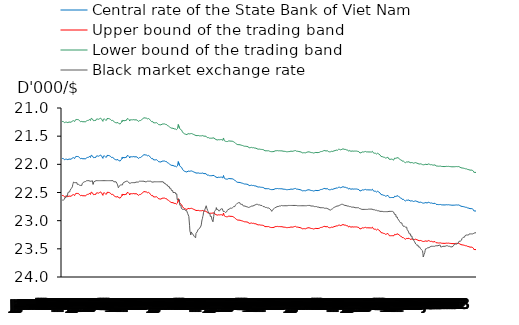
| Category | Central rate of the State Bank of Viet Nam | Upper bound of the trading band | Lower bound of the trading band | Black market exchange rate |
|---|---|---|---|---|
| 0 | 21.896 | 22.553 | 21.239 | 22.635 |
| 1900-01-01 | 21.896 | 22.553 | 21.239 | 22.635 |
| 1900-01-02 | 21.896 | 22.553 | 21.239 | 22.635 |
| 1900-01-03 | 21.896 | 22.553 | 21.239 | 22.635 |
| 1900-01-04 | 21.907 | 22.564 | 21.25 | 22.62 |
| 1900-01-05 | 21.907 | 22.564 | 21.25 | 22.62 |
| 1900-01-06 | 21.919 | 22.577 | 21.261 | 22.62 |
| 1900-01-07 | 21.909 | 22.566 | 21.252 | 22.59 |
| 1900-01-08 | 21.909 | 22.566 | 21.252 | 22.59 |
| 1900-01-09 | 21.909 | 22.566 | 21.252 | 22.59 |
| 1900-01-10 | 21.911 | 22.568 | 21.254 | 22.59 |
| 1900-01-11 | 21.913 | 22.57 | 21.256 | 22.56 |
| 1900-01-12 | 21.909 | 22.566 | 21.252 | 22.56 |
| 1900-01-13 | 21.907 | 22.564 | 21.25 | 22.56 |
| 1900-01-14 | 21.917 | 22.575 | 21.259 | 22.56 |
| 1900-01-15 | 21.917 | 22.575 | 21.259 | 22.51 |
| 1900-01-16 | 21.917 | 22.575 | 21.259 | 22.51 |
| 1900-01-17 | 21.913 | 22.57 | 21.256 | 22.49 |
| 1900-01-18 | 21.906 | 22.563 | 21.249 | 22.49 |
| 1900-01-19 | 21.901 | 22.558 | 21.244 | 22.49 |
| 1900-01-20 | 21.91 | 22.567 | 21.253 | 22.49 |
| 1900-01-21 | 21.908 | 22.565 | 21.251 | 22.46 |
| 1900-01-22 | 21.908 | 22.565 | 21.251 | 22.46 |
| 1900-01-23 | 21.908 | 22.565 | 21.251 | 22.46 |
| 1900-01-24 | 21.91 | 22.567 | 21.253 | 22.43 |
| 1900-01-25 | 21.898 | 22.555 | 21.241 | 22.43 |
| 1900-01-26 | 21.893 | 22.55 | 21.236 | 22.415 |
| 1900-01-27 | 21.886 | 22.543 | 21.229 | 22.4 |
| 1900-01-28 | 21.881 | 22.537 | 21.225 | 22.36 |
| 1900-01-29 | 21.881 | 22.537 | 21.225 | 22.34 |
| 1900-01-30 | 21.881 | 22.537 | 21.225 | 22.315 |
| 1900-01-31 | 21.892 | 22.549 | 21.235 | 22.305 |
| 1900-02-01 | 21.894 | 22.551 | 21.237 | 22.325 |
| 1900-02-02 | 21.897 | 22.554 | 21.24 | 22.325 |
| 1900-02-03 | 21.876 | 22.532 | 21.22 | 22.325 |
| 1900-02-04 | 21.861 | 22.517 | 21.205 | 22.325 |
| 1900-02-05 | 21.861 | 22.517 | 21.205 | 22.325 |
| 1900-02-06 | 21.861 | 22.517 | 21.205 | 22.325 |
| 1900-02-07 | 21.861 | 22.517 | 21.205 | 22.325 |
| 1900-02-08 | 21.861 | 22.517 | 21.205 | 22.325 |
| 1900-02-09 | 21.861 | 22.517 | 21.205 | 22.355 |
| 1900-02-10 | 21.861 | 22.517 | 21.205 | 22.355 |
| 1900-02-11 | 21.861 | 22.517 | 21.205 | 22.355 |
| 1900-02-12 | 21.861 | 22.517 | 21.205 | 22.355 |
| 1900-02-13 | 21.861 | 22.517 | 21.205 | 22.355 |
| 1900-02-14 | 21.873 | 22.529 | 21.217 | 22.37 |
| 1900-02-15 | 21.884 | 22.541 | 21.227 | 22.37 |
| 1900-02-16 | 21.895 | 22.552 | 21.238 | 22.37 |
| 1900-02-17 | 21.901 | 22.558 | 21.244 | 22.375 |
| 1900-02-18 | 21.9 | 22.557 | 21.243 | 22.375 |
| 1900-02-19 | 21.9 | 22.557 | 21.243 | 22.375 |
| 1900-02-20 | 21.9 | 22.557 | 21.243 | 22.375 |
| 1900-02-21 | 21.894 | 22.551 | 21.237 | 22.375 |
| 1900-02-22 | 21.899 | 22.556 | 21.242 | 22.345 |
| 1900-02-23 | 21.901 | 22.558 | 21.244 | 22.345 |
| 1900-02-24 | 21.903 | 22.56 | 21.246 | 22.335 |
| 1900-02-25 | 21.899 | 22.556 | 21.242 | 22.32 |
| 1900-02-26 | 21.899 | 22.556 | 21.242 | 22.31 |
| 1900-02-27 | 21.899 | 22.556 | 21.242 | 22.31 |
| 1900-02-28 | 21.914 | 22.571 | 21.257 | 22.31 |
| 1900-02-28 | 21.907 | 22.564 | 21.25 | 22.305 |
| 1900-03-01 | 21.905 | 22.562 | 21.248 | 22.305 |
| 1900-03-02 | 21.904 | 22.561 | 21.247 | 22.305 |
| 1900-03-03 | 21.889 | 22.546 | 21.232 | 22.305 |
| 1900-03-04 | 21.889 | 22.546 | 21.232 | 22.305 |
| 1900-03-05 | 21.889 | 22.546 | 21.232 | 22.29 |
| 1900-03-06 | 21.873 | 22.529 | 21.217 | 22.29 |
| 1900-03-07 | 21.878 | 22.534 | 21.222 | 22.29 |
| 1900-03-08 | 21.877 | 22.533 | 21.221 | 22.29 |
| 1900-03-09 | 21.884 | 22.541 | 21.227 | 22.29 |
| 1900-03-10 | 21.874 | 22.53 | 21.218 | 22.29 |
| 1900-03-11 | 21.874 | 22.53 | 21.218 | 22.29 |
| 1900-03-12 | 21.874 | 22.53 | 21.218 | 22.29 |
| 1900-03-13 | 21.859 | 22.515 | 21.203 | 22.29 |
| 1900-03-14 | 21.872 | 22.528 | 21.216 | 22.3 |
| 1900-03-15 | 21.878 | 22.534 | 21.222 | 22.3 |
| 1900-03-16 | 21.863 | 22.519 | 21.207 | 22.3 |
| 1900-03-17 | 21.838 | 22.493 | 21.183 | 22.3 |
| 1900-03-18 | 21.838 | 22.493 | 21.183 | 22.3 |
| 1900-03-19 | 21.838 | 22.493 | 21.183 | 22.3 |
| 1900-03-20 | 21.848 | 22.503 | 21.193 | 22.29 |
| 1900-03-21 | 21.853 | 22.509 | 21.197 | 22.29 |
| 1900-03-22 | 21.861 | 22.517 | 21.205 | 22.355 |
| 1900-03-23 | 21.882 | 22.538 | 21.226 | 22.33 |
| 1900-03-24 | 21.879 | 22.535 | 21.223 | 22.31 |
| 1900-03-25 | 21.879 | 22.535 | 21.223 | 22.3 |
| 1900-03-26 | 21.879 | 22.535 | 21.223 | 22.3 |
| 1900-03-27 | 21.891 | 22.548 | 21.234 | 22.3 |
| 1900-03-28 | 21.889 | 22.546 | 21.232 | 22.3 |
| 1900-03-29 | 21.878 | 22.534 | 21.222 | 22.29 |
| 1900-03-30 | 21.857 | 22.513 | 21.201 | 22.29 |
| 1900-03-31 | 21.85 | 22.506 | 21.194 | 22.29 |
| 1900-04-01 | 21.85 | 22.506 | 21.194 | 22.29 |
| 1900-04-02 | 21.85 | 22.506 | 21.194 | 22.29 |
| 1900-04-03 | 21.852 | 22.508 | 21.196 | 22.29 |
| 1900-04-04 | 21.853 | 22.509 | 21.197 | 22.29 |
| 1900-04-05 | 21.857 | 22.513 | 21.201 | 22.29 |
| 1900-04-06 | 21.852 | 22.508 | 21.196 | 22.29 |
| 1900-04-07 | 21.846 | 22.501 | 21.191 | 22.29 |
| 1900-04-08 | 21.846 | 22.501 | 21.191 | 22.29 |
| 1900-04-09 | 21.846 | 22.501 | 21.191 | 22.29 |
| 1900-04-10 | 21.842 | 22.497 | 21.187 | 22.29 |
| 1900-04-11 | 21.834 | 22.489 | 21.179 | 22.29 |
| 1900-04-12 | 21.838 | 22.493 | 21.183 | 22.29 |
| 1900-04-13 | 21.838 | 22.493 | 21.183 | 22.29 |
| 1900-04-14 | 21.862 | 22.518 | 21.206 | 22.29 |
| 1900-04-15 | 21.862 | 22.518 | 21.206 | 22.29 |
| 1900-04-16 | 21.862 | 22.518 | 21.206 | 22.29 |
| 1900-04-17 | 21.894 | 22.551 | 21.237 | 22.29 |
| 1900-04-18 | 21.855 | 22.511 | 21.199 | 22.29 |
| 1900-04-19 | 21.838 | 22.493 | 21.183 | 22.29 |
| 1900-04-20 | 21.848 | 22.503 | 21.193 | 22.29 |
| 1900-04-21 | 21.851 | 22.507 | 21.195 | 22.29 |
| 1900-04-22 | 21.851 | 22.507 | 21.195 | 22.29 |
| 1900-04-23 | 21.851 | 22.507 | 21.195 | 22.29 |
| 1900-04-24 | 21.87 | 22.526 | 21.214 | 22.29 |
| 1900-04-25 | 21.875 | 22.531 | 21.219 | 22.29 |
| 1900-04-26 | 21.873 | 22.529 | 21.217 | 22.29 |
| 1900-04-27 | 21.872 | 22.528 | 21.216 | 22.29 |
| 1900-04-28 | 21.842 | 22.497 | 21.187 | 22.29 |
| 1900-04-29 | 21.842 | 22.497 | 21.187 | 22.29 |
| 1900-04-30 | 21.842 | 22.497 | 21.187 | 22.29 |
| 1900-05-01 | 21.842 | 22.497 | 21.187 | 22.29 |
| 1900-05-02 | 21.842 | 22.497 | 21.187 | 22.29 |
| 1900-05-03 | 21.828 | 22.483 | 21.173 | 22.29 |
| 1900-05-04 | 21.846 | 22.501 | 21.191 | 22.29 |
| 1900-05-05 | 21.857 | 22.513 | 21.201 | 22.29 |
| 1900-05-06 | 21.857 | 22.513 | 21.201 | 22.29 |
| 1900-05-07 | 21.857 | 22.513 | 21.201 | 22.29 |
| 1900-05-08 | 21.858 | 22.514 | 21.202 | 22.29 |
| 1900-05-09 | 21.874 | 22.53 | 21.218 | 22.29 |
| 1900-05-10 | 21.88 | 22.536 | 21.224 | 22.29 |
| 1900-05-11 | 21.87 | 22.526 | 21.214 | 22.29 |
| 1900-05-12 | 21.877 | 22.533 | 21.221 | 22.29 |
| 1900-05-13 | 21.877 | 22.533 | 21.221 | 22.29 |
| 1900-05-14 | 21.877 | 22.533 | 21.221 | 22.29 |
| 1900-05-15 | 21.889 | 22.546 | 21.232 | 22.29 |
| 1900-05-16 | 21.892 | 22.549 | 21.235 | 22.31 |
| 1900-05-17 | 21.89 | 22.547 | 21.233 | 22.31 |
| 1900-05-18 | 21.911 | 22.568 | 21.254 | 22.31 |
| 1900-05-19 | 21.918 | 22.576 | 21.26 | 22.31 |
| 1900-05-20 | 21.918 | 22.576 | 21.26 | 22.31 |
| 1900-05-21 | 21.918 | 22.576 | 21.26 | 22.31 |
| 1900-05-22 | 21.913 | 22.57 | 21.256 | 22.31 |
| 1900-05-23 | 21.91 | 22.567 | 21.253 | 22.31 |
| 1900-05-24 | 21.921 | 22.579 | 21.263 | 22.335 |
| 1900-05-25 | 21.924 | 22.582 | 21.266 | 22.335 |
| 1900-05-26 | 21.915 | 22.572 | 21.258 | 22.365 |
| 1900-05-27 | 21.915 | 22.572 | 21.258 | 22.39 |
| 1900-05-28 | 21.915 | 22.572 | 21.258 | 22.415 |
| 1900-05-29 | 21.927 | 22.585 | 21.269 | 22.415 |
| 1900-05-30 | 21.939 | 22.597 | 21.281 | 22.39 |
| 1900-05-31 | 21.946 | 22.604 | 21.288 | 22.39 |
| 1900-06-01 | 21.939 | 22.597 | 21.281 | 22.39 |
| 1900-06-02 | 21.939 | 22.597 | 21.281 | 22.37 |
| 1900-06-03 | 21.939 | 22.597 | 21.281 | 22.37 |
| 1900-06-04 | 21.939 | 22.597 | 21.281 | 22.37 |
| 1900-06-05 | 21.914 | 22.571 | 21.257 | 22.365 |
| 1900-06-06 | 21.896 | 22.553 | 21.239 | 22.365 |
| 1900-06-07 | 21.876 | 22.532 | 21.22 | 22.365 |
| 1900-06-08 | 21.896 | 22.553 | 21.239 | 22.365 |
| 1900-06-09 | 21.874 | 22.53 | 21.218 | 22.335 |
| 1900-06-10 | 21.874 | 22.53 | 21.218 | 22.335 |
| 1900-06-11 | 21.874 | 22.53 | 21.218 | 22.32 |
| 1900-06-12 | 21.885 | 22.542 | 21.228 | 22.32 |
| 1900-06-13 | 21.877 | 22.533 | 21.221 | 22.32 |
| 1900-06-14 | 21.887 | 22.544 | 21.23 | 22.31 |
| 1900-06-15 | 21.878 | 22.534 | 21.222 | 22.31 |
| 1900-06-16 | 21.878 | 22.534 | 21.222 | 22.31 |
| 1900-06-17 | 21.878 | 22.534 | 21.222 | 22.3 |
| 1900-06-18 | 21.878 | 22.534 | 21.222 | 22.3 |
| 1900-06-19 | 21.863 | 22.519 | 21.207 | 22.3 |
| 1900-06-20 | 21.848 | 22.503 | 21.193 | 22.3 |
| 1900-06-21 | 21.85 | 22.506 | 21.194 | 22.3 |
| 1900-06-22 | 21.847 | 22.502 | 21.192 | 22.315 |
| 1900-06-23 | 21.845 | 22.5 | 21.19 | 22.315 |
| 1900-06-24 | 21.845 | 22.5 | 21.19 | 22.315 |
| 1900-06-25 | 21.845 | 22.5 | 21.19 | 22.325 |
| 1900-06-26 | 21.866 | 22.522 | 21.21 | 22.335 |
| 1900-06-27 | 21.888 | 22.545 | 21.231 | 22.335 |
| 1900-06-28 | 21.882 | 22.538 | 21.226 | 22.335 |
| 1900-06-29 | 21.864 | 22.52 | 21.208 | 22.335 |
| 1900-06-30 | 21.865 | 22.521 | 21.209 | 22.325 |
| 1900-07-01 | 21.865 | 22.521 | 21.209 | 22.325 |
| 1900-07-02 | 21.865 | 22.521 | 21.209 | 22.325 |
| 1900-07-03 | 21.858 | 22.514 | 21.202 | 22.325 |
| 1900-07-04 | 21.858 | 22.514 | 21.202 | 22.325 |
| 1900-07-05 | 21.866 | 22.522 | 21.21 | 22.325 |
| 1900-07-06 | 21.869 | 22.525 | 21.213 | 22.325 |
| 1900-07-07 | 21.862 | 22.518 | 21.206 | 22.325 |
| 1900-07-08 | 21.862 | 22.518 | 21.206 | 22.325 |
| 1900-07-09 | 21.862 | 22.518 | 21.206 | 22.325 |
| 1900-07-10 | 21.855 | 22.511 | 21.199 | 22.325 |
| 1900-07-11 | 21.869 | 22.525 | 21.213 | 22.325 |
| 1900-07-12 | 21.879 | 22.535 | 21.223 | 22.315 |
| 1900-07-13 | 21.875 | 22.531 | 21.219 | 22.315 |
| 1900-07-14 | 21.864 | 22.52 | 21.208 | 22.315 |
| 1900-07-15 | 21.864 | 22.52 | 21.208 | 22.315 |
| 1900-07-16 | 21.864 | 22.52 | 21.208 | 22.315 |
| 1900-07-17 | 21.873 | 22.529 | 21.217 | 22.315 |
| 1900-07-18 | 21.883 | 22.539 | 21.227 | 22.315 |
| 1900-07-19 | 21.888 | 22.545 | 21.231 | 22.315 |
| 1900-07-20 | 21.895 | 22.552 | 21.238 | 22.315 |
| 1900-07-21 | 21.881 | 22.537 | 21.225 | 22.3 |
| 1900-07-22 | 21.881 | 22.537 | 21.225 | 22.3 |
| 1900-07-23 | 21.881 | 22.537 | 21.225 | 22.3 |
| 1900-07-24 | 21.888 | 22.545 | 21.231 | 22.3 |
| 1900-07-25 | 21.89 | 22.547 | 21.233 | 22.3 |
| 1900-07-26 | 21.878 | 22.534 | 21.222 | 22.3 |
| 1900-07-27 | 21.875 | 22.531 | 21.219 | 22.3 |
| 1900-07-28 | 21.862 | 22.518 | 21.206 | 22.3 |
| 1900-07-29 | 21.862 | 22.518 | 21.206 | 22.3 |
| 1900-07-30 | 21.862 | 22.518 | 21.206 | 22.3 |
| 1900-07-31 | 21.853 | 22.509 | 21.197 | 22.3 |
| 1900-08-01 | 21.845 | 22.5 | 21.19 | 22.3 |
| 1900-08-02 | 21.83 | 22.485 | 21.175 | 22.3 |
| 1900-08-03 | 21.833 | 22.488 | 21.178 | 22.3 |
| 1900-08-04 | 21.828 | 22.483 | 21.173 | 22.3 |
| 1900-08-05 | 21.828 | 22.483 | 21.173 | 22.31 |
| 1900-08-06 | 21.828 | 22.483 | 21.173 | 22.31 |
| 1900-08-07 | 21.833 | 22.488 | 21.178 | 22.31 |
| 1900-08-08 | 21.84 | 22.495 | 21.185 | 22.31 |
| 1900-08-09 | 21.838 | 22.493 | 21.183 | 22.31 |
| 1900-08-10 | 21.833 | 22.488 | 21.178 | 22.31 |
| 1900-08-11 | 21.849 | 22.504 | 21.194 | 22.31 |
| 1900-08-12 | 21.849 | 22.504 | 21.194 | 22.31 |
| 1900-08-13 | 21.849 | 22.504 | 21.194 | 22.3 |
| 1900-08-14 | 21.847 | 22.502 | 21.192 | 22.3 |
| 1900-08-15 | 21.846 | 22.501 | 21.191 | 22.3 |
| 1900-08-16 | 21.842 | 22.497 | 21.187 | 22.3 |
| 1900-08-17 | 21.857 | 22.513 | 21.201 | 22.3 |
| 1900-08-18 | 21.856 | 22.512 | 21.2 | 22.3 |
| 1900-08-19 | 21.856 | 22.512 | 21.2 | 22.3 |
| 1900-08-20 | 21.856 | 22.512 | 21.2 | 22.3 |
| 1900-08-21 | 21.875 | 22.531 | 21.219 | 22.3 |
| 1900-08-22 | 21.886 | 22.543 | 21.229 | 22.3 |
| 1900-08-23 | 21.884 | 22.541 | 21.227 | 22.3 |
| 1900-08-24 | 21.898 | 22.555 | 21.241 | 22.315 |
| 1900-08-25 | 21.895 | 22.552 | 21.238 | 22.315 |
| 1900-08-26 | 21.895 | 22.552 | 21.238 | 22.315 |
| 1900-08-27 | 21.895 | 22.552 | 21.238 | 22.315 |
| 1900-08-28 | 21.914 | 22.571 | 21.257 | 22.315 |
| 1900-08-29 | 21.912 | 22.569 | 21.255 | 22.31 |
| 1900-08-30 | 21.921 | 22.579 | 21.263 | 22.31 |
| 1900-08-31 | 21.921 | 22.579 | 21.263 | 22.31 |
| 1900-09-01 | 21.921 | 22.579 | 21.263 | 22.31 |
| 1900-09-02 | 21.921 | 22.579 | 21.263 | 22.31 |
| 1900-09-03 | 21.921 | 22.579 | 21.263 | 22.31 |
| 1900-09-04 | 21.925 | 22.583 | 21.267 | 22.31 |
| 1900-09-05 | 21.922 | 22.58 | 21.264 | 22.31 |
| 1900-09-06 | 21.917 | 22.575 | 21.259 | 22.31 |
| 1900-09-07 | 21.914 | 22.571 | 21.257 | 22.31 |
| 1900-09-08 | 21.932 | 22.59 | 21.274 | 22.31 |
| 1900-09-09 | 21.932 | 22.59 | 21.274 | 22.31 |
| 1900-09-10 | 21.932 | 22.59 | 21.274 | 22.31 |
| 1900-09-11 | 21.945 | 22.603 | 21.287 | 22.31 |
| 1900-09-12 | 21.954 | 22.613 | 21.295 | 22.31 |
| 1900-09-13 | 21.965 | 22.624 | 21.306 | 22.31 |
| 1900-09-14 | 21.958 | 22.617 | 21.299 | 22.31 |
| 1900-09-15 | 21.956 | 22.615 | 21.297 | 22.31 |
| 1900-09-16 | 21.956 | 22.615 | 21.297 | 22.31 |
| 1900-09-17 | 21.956 | 22.615 | 21.297 | 22.31 |
| 1900-09-18 | 21.959 | 22.618 | 21.3 | 22.31 |
| 1900-09-19 | 21.953 | 22.612 | 21.294 | 22.31 |
| 1900-09-20 | 21.953 | 22.612 | 21.294 | 22.31 |
| 1900-09-21 | 21.944 | 22.602 | 21.286 | 22.31 |
| 1900-09-22 | 21.942 | 22.6 | 21.284 | 22.31 |
| 1900-09-23 | 21.942 | 22.6 | 21.284 | 22.31 |
| 1900-09-24 | 21.942 | 22.6 | 21.284 | 22.31 |
| 1900-09-25 | 21.946 | 22.604 | 21.288 | 22.31 |
| 1900-09-26 | 21.943 | 22.601 | 21.285 | 22.335 |
| 1900-09-27 | 21.94 | 22.598 | 21.282 | 22.335 |
| 1900-09-28 | 21.94 | 22.598 | 21.282 | 22.335 |
| 1900-09-29 | 21.949 | 22.607 | 21.291 | 22.335 |
| 1900-09-30 | 21.949 | 22.607 | 21.291 | 22.335 |
| 1900-10-01 | 21.949 | 22.607 | 21.291 | 22.335 |
| 1900-10-02 | 21.948 | 22.606 | 21.29 | 22.365 |
| 1900-10-03 | 21.952 | 22.611 | 21.293 | 22.365 |
| 1900-10-04 | 21.964 | 22.623 | 21.305 | 22.365 |
| 1900-10-05 | 21.971 | 22.63 | 21.312 | 22.365 |
| 1900-10-06 | 21.98 | 22.639 | 21.321 | 22.365 |
| 1900-10-07 | 21.98 | 22.639 | 21.321 | 22.395 |
| 1900-10-08 | 21.98 | 22.639 | 21.321 | 22.395 |
| 1900-10-09 | 21.97 | 22.629 | 21.311 | 22.395 |
| 1900-10-10 | 21.987 | 22.647 | 21.327 | 22.395 |
| 1900-10-11 | 21.997 | 22.657 | 21.337 | 22.425 |
| 1900-10-12 | 22.012 | 22.672 | 21.352 | 22.425 |
| 1900-10-13 | 22.011 | 22.671 | 21.351 | 22.425 |
| 1900-10-14 | 22.011 | 22.671 | 21.351 | 22.425 |
| 1900-10-15 | 22.011 | 22.671 | 21.351 | 22.425 |
| 1900-10-16 | 22.016 | 22.676 | 21.356 | 22.465 |
| 1900-10-17 | 22.02 | 22.681 | 21.359 | 22.465 |
| 1900-10-18 | 22.011 | 22.671 | 21.351 | 22.465 |
| 1900-10-19 | 22.005 | 22.665 | 21.345 | 22.465 |
| 1900-10-20 | 22.019 | 22.68 | 21.358 | 22.5 |
| 1900-10-21 | 22.019 | 22.68 | 21.358 | 22.5 |
| 1900-10-22 | 22.019 | 22.68 | 21.358 | 22.5 |
| 1900-10-23 | 22.032 | 22.693 | 21.371 | 22.5 |
| 1900-10-24 | 22.033 | 22.694 | 21.372 | 22.5 |
| 1900-10-25 | 22.03 | 22.691 | 21.369 | 22.5 |
| 1900-10-26 | 22.032 | 22.693 | 21.371 | 22.5 |
| 1900-10-27 | 22.045 | 22.706 | 21.384 | 22.525 |
| 1900-10-28 | 22.045 | 22.706 | 21.384 | 22.525 |
| 1900-10-29 | 22.045 | 22.706 | 21.384 | 22.525 |
| 1900-10-30 | 22.039 | 22.7 | 21.378 | 22.525 |
| 1900-10-31 | 22.033 | 22.694 | 21.372 | 22.625 |
| 1900-11-01 | 22.027 | 22.688 | 21.366 | 22.625 |
| 1900-11-02 | 22.018 | 22.679 | 21.357 | 22.625 |
| 1900-11-03 | 21.952 | 22.611 | 21.293 | 22.625 |
| 1900-11-04 | 21.952 | 22.611 | 21.293 | 22.625 |
| 1900-11-05 | 21.952 | 22.611 | 21.293 | 22.625 |
| 1900-11-06 | 22.015 | 22.675 | 21.355 | 22.625 |
| 1900-11-07 | 22.029 | 22.69 | 21.368 | 22.725 |
| 1900-11-08 | 22.025 | 22.686 | 21.364 | 22.725 |
| 1900-11-09 | 22.043 | 22.704 | 21.382 | 22.725 |
| 1900-11-10 | 22.056 | 22.718 | 21.394 | 22.725 |
| 1900-11-11 | 22.056 | 22.718 | 21.394 | 22.775 |
| 1900-11-12 | 22.056 | 22.718 | 21.394 | 22.775 |
| 1900-11-13 | 22.067 | 22.729 | 21.405 | 22.775 |
| 1900-11-14 | 22.086 | 22.749 | 21.423 | 22.8 |
| 1900-11-15 | 22.093 | 22.756 | 21.43 | 22.8 |
| 1900-11-16 | 22.101 | 22.764 | 21.438 | 22.8 |
| 1900-11-17 | 22.112 | 22.775 | 21.449 | 22.8 |
| 1900-11-18 | 22.112 | 22.775 | 21.449 | 22.8 |
| 1900-11-19 | 22.112 | 22.775 | 21.449 | 22.8 |
| 1900-11-20 | 22.124 | 22.788 | 21.46 | 22.8 |
| 1900-11-21 | 22.12 | 22.784 | 21.456 | 22.8 |
| 1900-11-22 | 22.118 | 22.782 | 21.454 | 22.82 |
| 1900-11-23 | 22.131 | 22.795 | 21.467 | 22.82 |
| 1900-11-24 | 22.137 | 22.801 | 21.473 | 22.82 |
| 1900-11-25 | 22.137 | 22.801 | 21.473 | 22.82 |
| 1900-11-26 | 22.137 | 22.801 | 21.473 | 22.82 |
| 1900-11-27 | 22.132 | 22.796 | 21.468 | 22.82 |
| 1900-11-28 | 22.121 | 22.785 | 21.457 | 22.875 |
| 1900-11-29 | 22.118 | 22.782 | 21.454 | 22.875 |
| 1900-11-30 | 22.127 | 22.791 | 21.463 | 22.875 |
| 1900-12-01 | 22.124 | 22.788 | 21.46 | 22.925 |
| 1900-12-02 | 22.124 | 22.788 | 21.46 | 22.925 |
| 1900-12-03 | 22.124 | 22.788 | 21.46 | 23.09 |
| 1900-12-04 | 22.118 | 22.782 | 21.454 | 23.19 |
| 1900-12-05 | 22.12 | 22.784 | 21.456 | 23.21 |
| 1900-12-06 | 22.124 | 22.788 | 21.46 | 23.25 |
| 1900-12-07 | 22.115 | 22.778 | 21.452 | 23.2 |
| 1900-12-08 | 22.117 | 22.781 | 21.453 | 23.205 |
| 1900-12-09 | 22.117 | 22.781 | 21.453 | 23.205 |
| 1900-12-10 | 22.117 | 22.781 | 21.453 | 23.225 |
| 1900-12-11 | 22.125 | 22.789 | 21.461 | 23.225 |
| 1900-12-12 | 22.12 | 22.784 | 21.456 | 23.225 |
| 1900-12-13 | 22.124 | 22.788 | 21.46 | 23.255 |
| 1900-12-14 | 22.135 | 22.799 | 21.471 | 23.27 |
| 1900-12-15 | 22.144 | 22.808 | 21.48 | 23.27 |
| 1900-12-16 | 22.144 | 22.808 | 21.48 | 23.285 |
| 1900-12-17 | 22.144 | 22.808 | 21.48 | 23.285 |
| 1900-12-18 | 22.148 | 22.812 | 21.484 | 23.28 |
| 1900-12-19 | 22.148 | 22.812 | 21.484 | 23.305 |
| 1900-12-20 | 22.154 | 22.819 | 21.489 | 23.225 |
| 1900-12-21 | 22.152 | 22.817 | 21.487 | 23.225 |
| 1900-12-22 | 22.155 | 22.82 | 21.49 | 23.225 |
| 1900-12-23 | 22.155 | 22.82 | 21.49 | 23.2 |
| 1900-12-24 | 22.155 | 22.82 | 21.49 | 23.2 |
| 1900-12-25 | 22.153 | 22.818 | 21.488 | 23.165 |
| 1900-12-26 | 22.152 | 22.817 | 21.487 | 23.165 |
| 1900-12-27 | 22.156 | 22.821 | 21.491 | 23.165 |
| 1900-12-28 | 22.162 | 22.827 | 21.497 | 23.14 |
| 1900-12-29 | 22.159 | 22.824 | 21.494 | 23.14 |
| 1900-12-30 | 22.159 | 22.824 | 21.494 | 23.14 |
| 1900-12-31 | 22.159 | 22.824 | 21.494 | 23.125 |
| 1901-01-01 | 22.159 | 22.824 | 21.494 | 23.125 |
| 1901-01-02 | 22.158 | 22.823 | 21.493 | 23.095 |
| 1901-01-03 | 22.162 | 22.827 | 21.497 | 23.075 |
| 1901-01-04 | 22.159 | 22.824 | 21.494 | 23.025 |
| 1901-01-05 | 22.154 | 22.819 | 21.489 | 22.985 |
| 1901-01-06 | 22.154 | 22.819 | 21.489 | 22.965 |
| 1901-01-07 | 22.154 | 22.819 | 21.489 | 22.925 |
| 1901-01-08 | 22.167 | 22.832 | 21.502 | 22.905 |
| 1901-01-09 | 22.167 | 22.832 | 21.502 | 22.85 |
| 1901-01-10 | 22.166 | 22.831 | 21.501 | 22.85 |
| 1901-01-11 | 22.164 | 22.829 | 21.499 | 22.82 |
| 1901-01-12 | 22.164 | 22.829 | 21.499 | 22.82 |
| 1901-01-13 | 22.164 | 22.829 | 21.499 | 22.795 |
| 1901-01-14 | 22.164 | 22.829 | 21.499 | 22.775 |
| 1901-01-15 | 22.161 | 22.826 | 21.496 | 22.755 |
| 1901-01-16 | 22.168 | 22.833 | 21.503 | 22.735 |
| 1901-01-17 | 22.164 | 22.829 | 21.499 | 22.72 |
| 1901-01-18 | 22.18 | 22.845 | 21.515 | 22.785 |
| 1901-01-19 | 22.193 | 22.859 | 21.527 | 22.785 |
| 1901-01-20 | 22.193 | 22.859 | 21.527 | 22.82 |
| 1901-01-21 | 22.193 | 22.859 | 21.527 | 22.82 |
| 1901-01-22 | 22.191 | 22.857 | 21.525 | 22.82 |
| 1901-01-23 | 22.187 | 22.853 | 21.521 | 22.875 |
| 1901-01-24 | 22.202 | 22.868 | 21.536 | 22.875 |
| 1901-01-25 | 22.202 | 22.868 | 21.536 | 22.875 |
| 1901-01-26 | 22.202 | 22.868 | 21.536 | 22.875 |
| 1901-01-27 | 22.202 | 22.868 | 21.536 | 22.925 |
| 1901-01-28 | 22.202 | 22.868 | 21.536 | 22.925 |
| 1901-01-29 | 22.202 | 22.868 | 21.536 | 22.925 |
| 1901-01-30 | 22.202 | 22.868 | 21.536 | 22.925 |
| 1901-01-31 | 22.202 | 22.868 | 21.536 | 22.975 |
| 1901-02-01 | 22.199 | 22.865 | 21.533 | 22.975 |
| 1901-02-02 | 22.198 | 22.864 | 21.532 | 22.975 |
| 1901-02-03 | 22.198 | 22.864 | 21.532 | 23.02 |
| 1901-02-04 | 22.198 | 22.864 | 21.532 | 22.97 |
| 1901-02-05 | 22.197 | 22.863 | 21.531 | 22.925 |
| 1901-02-06 | 22.197 | 22.863 | 21.531 | 22.875 |
| 1901-02-07 | 22.208 | 22.874 | 21.542 | 22.84 |
| 1901-02-08 | 22.216 | 22.882 | 21.55 | 22.84 |
| 1901-02-09 | 22.224 | 22.891 | 21.557 | 22.82 |
| 1901-02-10 | 22.224 | 22.891 | 21.557 | 22.82 |
| 1901-02-11 | 22.224 | 22.891 | 21.557 | 22.8 |
| 1901-02-12 | 22.234 | 22.901 | 21.567 | 22.77 |
| 1901-02-13 | 22.235 | 22.902 | 21.568 | 22.8 |
| 1901-02-14 | 22.236 | 22.903 | 21.569 | 22.8 |
| 1901-02-15 | 22.234 | 22.901 | 21.567 | 22.8 |
| 1901-02-16 | 22.229 | 22.896 | 21.562 | 22.8 |
| 1901-02-17 | 22.229 | 22.896 | 21.562 | 22.8 |
| 1901-02-18 | 22.229 | 22.896 | 21.562 | 22.825 |
| 1901-02-19 | 22.231 | 22.898 | 21.564 | 22.825 |
| 1901-02-20 | 22.231 | 22.898 | 21.564 | 22.825 |
| 1901-02-21 | 22.235 | 22.902 | 21.568 | 22.825 |
| 1901-02-22 | 22.231 | 22.898 | 21.564 | 22.805 |
| 1901-02-23 | 22.228 | 22.895 | 21.561 | 22.805 |
| 1901-02-24 | 22.228 | 22.895 | 21.561 | 22.805 |
| 1901-02-25 | 22.228 | 22.895 | 21.561 | 22.79 |
| 1901-02-26 | 22.228 | 22.895 | 21.561 | 22.79 |
| 1901-02-27 | 22.232 | 22.899 | 21.565 | 22.78 |
| 1901-02-28 | 22.232 | 22.899 | 21.565 | 22.79 |
| 1901-03-01 | 22.241 | 22.908 | 21.574 | 22.815 |
| 1901-03-02 | 22.246 | 22.913 | 21.579 | 22.835 |
| 1901-03-03 | 22.198 | 22.864 | 21.532 | 22.835 |
| 1901-03-04 | 22.198 | 22.864 | 21.532 | 22.835 |
| 1901-03-05 | 22.246 | 22.913 | 21.579 | 22.835 |
| 1901-03-06 | 22.246 | 22.913 | 21.579 | 22.845 |
| 1901-03-07 | 22.246 | 22.913 | 21.579 | 22.845 |
| 1901-03-08 | 22.258 | 22.926 | 21.59 | 22.855 |
| 1901-03-09 | 22.263 | 22.931 | 21.595 | 22.855 |
| 1901-03-10 | 22.263 | 22.931 | 21.595 | 22.855 |
| 1901-03-11 | 22.263 | 22.931 | 21.595 | 22.845 |
| 1901-03-12 | 22.262 | 22.93 | 21.594 | 22.845 |
| 1901-03-13 | 22.262 | 22.93 | 21.594 | 22.82 |
| 1901-03-14 | 22.262 | 22.93 | 21.594 | 22.81 |
| 1901-03-15 | 22.252 | 22.92 | 21.584 | 22.8 |
| 1901-03-16 | 22.251 | 22.919 | 21.583 | 22.8 |
| 1901-03-17 | 22.251 | 22.919 | 21.583 | 22.8 |
| 1901-03-18 | 22.251 | 22.919 | 21.583 | 22.8 |
| 1901-03-19 | 22.254 | 22.922 | 21.586 | 22.785 |
| 1901-03-20 | 22.254 | 22.922 | 21.586 | 22.785 |
| 1901-03-21 | 22.253 | 22.921 | 21.585 | 22.775 |
| 1901-03-22 | 22.253 | 22.921 | 21.585 | 22.775 |
| 1901-03-23 | 22.256 | 22.924 | 21.588 | 22.78 |
| 1901-03-24 | 22.256 | 22.924 | 21.588 | 22.78 |
| 1901-03-25 | 22.256 | 22.924 | 21.588 | 22.78 |
| 1901-03-26 | 22.256 | 22.924 | 21.588 | 22.775 |
| 1901-03-27 | 22.253 | 22.921 | 21.585 | 22.77 |
| 1901-03-28 | 22.26 | 22.928 | 21.592 | 22.77 |
| 1901-03-29 | 22.265 | 22.933 | 21.597 | 22.77 |
| 1901-03-30 | 22.276 | 22.944 | 21.608 | 22.75 |
| 1901-03-31 | 22.276 | 22.944 | 21.608 | 22.75 |
| 1901-04-01 | 22.276 | 22.944 | 21.608 | 22.75 |
| 1901-04-02 | 22.281 | 22.949 | 21.613 | 22.75 |
| 1901-04-03 | 22.288 | 22.957 | 21.619 | 22.73 |
| 1901-04-04 | 22.297 | 22.966 | 21.628 | 22.73 |
| 1901-04-05 | 22.297 | 22.966 | 21.628 | 22.73 |
| 1901-04-06 | 22.311 | 22.98 | 21.642 | 22.71 |
| 1901-04-07 | 22.311 | 22.98 | 21.642 | 22.71 |
| 1901-04-08 | 22.311 | 22.98 | 21.642 | 22.71 |
| 1901-04-09 | 22.316 | 22.985 | 21.647 | 22.69 |
| 1901-04-10 | 22.321 | 22.991 | 21.651 | 22.68 |
| 1901-04-11 | 22.321 | 22.991 | 21.651 | 22.68 |
| 1901-04-12 | 22.32 | 22.99 | 21.65 | 22.68 |
| 1901-04-13 | 22.32 | 22.99 | 21.65 | 22.68 |
| 1901-04-14 | 22.32 | 22.99 | 21.65 | 22.68 |
| 1901-04-15 | 22.32 | 22.99 | 21.65 | 22.68 |
| 1901-04-16 | 22.323 | 22.993 | 21.653 | 22.7 |
| 1901-04-17 | 22.323 | 22.993 | 21.653 | 22.7 |
| 1901-04-18 | 22.322 | 22.992 | 21.652 | 22.71 |
| 1901-04-19 | 22.33 | 23 | 21.66 | 22.71 |
| 1901-04-20 | 22.335 | 23.005 | 21.665 | 22.71 |
| 1901-04-21 | 22.335 | 23.005 | 21.665 | 22.71 |
| 1901-04-22 | 22.335 | 23.005 | 21.665 | 22.71 |
| 1901-04-23 | 22.339 | 23.009 | 21.669 | 22.73 |
| 1901-04-24 | 22.344 | 23.014 | 21.674 | 22.73 |
| 1901-04-25 | 22.343 | 23.013 | 21.673 | 22.73 |
| 1901-04-26 | 22.347 | 23.017 | 21.677 | 22.74 |
| 1901-04-27 | 22.35 | 23.02 | 21.68 | 22.74 |
| 1901-04-28 | 22.35 | 23.02 | 21.68 | 22.74 |
| 1901-04-29 | 22.35 | 23.02 | 21.68 | 22.74 |
| 1901-04-30 | 22.35 | 23.02 | 21.68 | 22.75 |
| 1901-05-01 | 22.35 | 23.02 | 21.68 | 22.75 |
| 1901-05-02 | 22.35 | 23.02 | 21.68 | 22.75 |
| 1901-05-03 | 22.355 | 23.026 | 21.684 | 22.755 |
| 1901-05-04 | 22.353 | 23.024 | 21.682 | 22.755 |
| 1901-05-05 | 22.353 | 23.024 | 21.682 | 22.755 |
| 1901-05-06 | 22.353 | 23.024 | 21.682 | 22.765 |
| 1901-05-07 | 22.358 | 23.029 | 21.687 | 22.765 |
| 1901-05-08 | 22.364 | 23.035 | 21.693 | 22.765 |
| 1901-05-09 | 22.373 | 23.044 | 21.702 | 22.76 |
| 1901-05-10 | 22.377 | 23.048 | 21.706 | 22.76 |
| 1901-05-11 | 22.375 | 23.046 | 21.704 | 22.76 |
| 1901-05-12 | 22.375 | 23.046 | 21.704 | 22.76 |
| 1901-05-13 | 22.375 | 23.046 | 21.704 | 22.75 |
| 1901-05-14 | 22.373 | 23.044 | 21.702 | 22.75 |
| 1901-05-15 | 22.372 | 23.043 | 21.701 | 22.75 |
| 1901-05-16 | 22.37 | 23.041 | 21.699 | 22.75 |
| 1901-05-17 | 22.368 | 23.039 | 21.697 | 22.74 |
| 1901-05-18 | 22.377 | 23.048 | 21.706 | 22.74 |
| 1901-05-19 | 22.377 | 23.048 | 21.706 | 22.74 |
| 1901-05-20 | 22.377 | 23.048 | 21.706 | 22.74 |
| 1901-05-21 | 22.375 | 23.046 | 21.704 | 22.73 |
| 1901-05-22 | 22.375 | 23.046 | 21.704 | 22.73 |
| 1901-05-23 | 22.384 | 23.056 | 21.712 | 22.73 |
| 1901-05-24 | 22.384 | 23.056 | 21.712 | 22.73 |
| 1901-05-25 | 22.384 | 23.056 | 21.712 | 22.72 |
| 1901-05-26 | 22.384 | 23.056 | 21.712 | 22.72 |
| 1901-05-27 | 22.384 | 23.056 | 21.712 | 22.72 |
| 1901-05-28 | 22.384 | 23.056 | 21.712 | 22.72 |
| 1901-05-29 | 22.391 | 23.063 | 21.719 | 22.71 |
| 1901-05-30 | 22.396 | 23.068 | 21.724 | 22.71 |
| 1901-05-31 | 22.396 | 23.068 | 21.724 | 22.71 |
| 1901-06-01 | 22.403 | 23.075 | 21.731 | 22.71 |
| 1901-06-02 | 22.403 | 23.075 | 21.731 | 22.71 |
| 1901-06-03 | 22.403 | 23.075 | 21.731 | 22.71 |
| 1901-06-04 | 22.403 | 23.075 | 21.731 | 22.72 |
| 1901-06-05 | 22.403 | 23.075 | 21.731 | 22.72 |
| 1901-06-06 | 22.401 | 23.073 | 21.729 | 22.72 |
| 1901-06-07 | 22.406 | 23.078 | 21.734 | 22.72 |
| 1901-06-08 | 22.406 | 23.078 | 21.734 | 22.72 |
| 1901-06-09 | 22.406 | 23.078 | 21.734 | 22.72 |
| 1901-06-10 | 22.406 | 23.078 | 21.734 | 22.73 |
| 1901-06-11 | 22.408 | 23.08 | 21.736 | 22.73 |
| 1901-06-12 | 22.408 | 23.08 | 21.736 | 22.73 |
| 1901-06-13 | 22.408 | 23.08 | 21.736 | 22.73 |
| 1901-06-14 | 22.405 | 23.077 | 21.733 | 22.73 |
| 1901-06-15 | 22.41 | 23.082 | 21.738 | 22.73 |
| 1901-06-16 | 22.41 | 23.082 | 21.738 | 22.75 |
| 1901-06-17 | 22.41 | 23.082 | 21.738 | 22.75 |
| 1901-06-18 | 22.417 | 23.09 | 21.744 | 22.75 |
| 1901-06-19 | 22.422 | 23.095 | 21.749 | 22.75 |
| 1901-06-20 | 22.428 | 23.101 | 21.755 | 22.75 |
| 1901-06-21 | 22.433 | 23.106 | 21.76 | 22.765 |
| 1901-06-22 | 22.432 | 23.105 | 21.759 | 22.765 |
| 1901-06-23 | 22.432 | 23.105 | 21.759 | 22.765 |
| 1901-06-24 | 22.432 | 23.105 | 21.759 | 22.765 |
| 1901-06-25 | 22.431 | 23.104 | 21.758 | 22.765 |
| 1901-06-26 | 22.436 | 23.109 | 21.763 | 22.775 |
| 1901-06-27 | 22.433 | 23.106 | 21.76 | 22.775 |
| 1901-06-28 | 22.432 | 23.105 | 21.759 | 22.775 |
| 1901-06-29 | 22.431 | 23.104 | 21.758 | 22.775 |
| 1901-06-30 | 22.431 | 23.104 | 21.758 | 22.775 |
| 1901-07-01 | 22.431 | 23.104 | 21.758 | 22.775 |
| 1901-07-02 | 22.431 | 23.104 | 21.758 | 22.775 |
| 1901-07-03 | 22.44 | 23.113 | 21.767 | 22.79 |
| 1901-07-04 | 22.444 | 23.117 | 21.771 | 22.79 |
| 1901-07-05 | 22.447 | 23.12 | 21.774 | 22.79 |
| 1901-07-06 | 22.447 | 23.12 | 21.774 | 22.8 |
| 1901-07-07 | 22.447 | 23.12 | 21.774 | 22.81 |
| 1901-07-08 | 22.447 | 23.12 | 21.774 | 22.81 |
| 1901-07-09 | 22.449 | 23.122 | 21.776 | 22.835 |
| 1901-07-10 | 22.449 | 23.122 | 21.776 | 22.835 |
| 1901-07-11 | 22.448 | 23.121 | 21.775 | 22.815 |
| 1901-07-12 | 22.448 | 23.121 | 21.775 | 22.815 |
| 1901-07-13 | 22.445 | 23.118 | 21.772 | 22.815 |
| 1901-07-14 | 22.445 | 23.118 | 21.772 | 22.79 |
| 1901-07-15 | 22.445 | 23.118 | 21.772 | 22.79 |
| 1901-07-16 | 22.437 | 23.11 | 21.764 | 22.79 |
| 1901-07-17 | 22.436 | 23.109 | 21.763 | 22.77 |
| 1901-07-18 | 22.433 | 23.106 | 21.76 | 22.765 |
| 1901-07-19 | 22.433 | 23.106 | 21.76 | 22.765 |
| 1901-07-20 | 22.432 | 23.105 | 21.759 | 22.765 |
| 1901-07-21 | 22.432 | 23.105 | 21.759 | 22.765 |
| 1901-07-22 | 22.432 | 23.105 | 21.759 | 22.75 |
| 1901-07-23 | 22.429 | 23.102 | 21.756 | 22.75 |
| 1901-07-24 | 22.429 | 23.102 | 21.756 | 22.75 |
| 1901-07-25 | 22.433 | 23.106 | 21.76 | 22.75 |
| 1901-07-26 | 22.43 | 23.103 | 21.757 | 22.75 |
| 1901-07-27 | 22.433 | 23.106 | 21.76 | 22.75 |
| 1901-07-28 | 22.433 | 23.106 | 21.76 | 22.75 |
| 1901-07-29 | 22.433 | 23.106 | 21.76 | 22.74 |
| 1901-07-30 | 22.432 | 23.105 | 21.759 | 22.74 |
| 1901-07-31 | 22.429 | 23.102 | 21.756 | 22.74 |
| 1901-08-01 | 22.43 | 23.103 | 21.757 | 22.74 |
| 1901-08-02 | 22.434 | 23.107 | 21.761 | 22.74 |
| 1901-08-03 | 22.434 | 23.107 | 21.761 | 22.73 |
| 1901-08-04 | 22.434 | 23.107 | 21.761 | 22.73 |
| 1901-08-05 | 22.434 | 23.107 | 21.761 | 22.73 |
| 1901-08-06 | 22.44 | 23.113 | 21.767 | 22.735 |
| 1901-08-07 | 22.44 | 23.113 | 21.767 | 22.735 |
| 1901-08-08 | 22.44 | 23.113 | 21.767 | 22.735 |
| 1901-08-09 | 22.443 | 23.116 | 21.77 | 22.735 |
| 1901-08-10 | 22.442 | 23.115 | 21.769 | 22.735 |
| 1901-08-11 | 22.442 | 23.115 | 21.769 | 22.735 |
| 1901-08-12 | 22.442 | 23.115 | 21.769 | 22.735 |
| 1901-08-13 | 22.441 | 23.114 | 21.768 | 22.735 |
| 1901-08-14 | 22.444 | 23.117 | 21.771 | 22.735 |
| 1901-08-15 | 22.45 | 23.124 | 21.776 | 22.735 |
| 1901-08-16 | 22.45 | 23.124 | 21.776 | 22.735 |
| 1901-08-17 | 22.45 | 23.124 | 21.776 | 22.735 |
| 1901-08-18 | 22.45 | 23.124 | 21.776 | 22.735 |
| 1901-08-19 | 22.45 | 23.124 | 21.776 | 22.735 |
| 1901-08-20 | 22.45 | 23.124 | 21.776 | 22.73 |
| 1901-08-21 | 22.448 | 23.121 | 21.775 | 22.73 |
| 1901-08-22 | 22.447 | 23.12 | 21.774 | 22.73 |
| 1901-08-23 | 22.447 | 23.12 | 21.774 | 22.73 |
| 1901-08-24 | 22.446 | 23.119 | 21.773 | 22.73 |
| 1901-08-25 | 22.446 | 23.119 | 21.773 | 22.73 |
| 1901-08-26 | 22.446 | 23.119 | 21.773 | 22.73 |
| 1901-08-27 | 22.443 | 23.116 | 21.77 | 22.73 |
| 1901-08-28 | 22.438 | 23.111 | 21.765 | 22.73 |
| 1901-08-29 | 22.438 | 23.111 | 21.765 | 22.73 |
| 1901-08-30 | 22.443 | 23.116 | 21.77 | 22.73 |
| 1901-08-31 | 22.443 | 23.116 | 21.77 | 22.73 |
| 1901-09-01 | 22.443 | 23.116 | 21.77 | 22.73 |
| 1901-09-02 | 22.443 | 23.116 | 21.77 | 22.73 |
| 1901-09-03 | 22.443 | 23.116 | 21.77 | 22.73 |
| 1901-09-04 | 22.439 | 23.112 | 21.766 | 22.73 |
| 1901-09-05 | 22.434 | 23.107 | 21.761 | 22.73 |
| 1901-09-06 | 22.439 | 23.112 | 21.766 | 22.73 |
| 1901-09-07 | 22.432 | 23.105 | 21.759 | 22.73 |
| 1901-09-08 | 22.432 | 23.105 | 21.759 | 22.73 |
| 1901-09-09 | 22.432 | 23.105 | 21.759 | 22.73 |
| 1901-09-10 | 22.428 | 23.101 | 21.755 | 22.73 |
| 1901-09-11 | 22.434 | 23.107 | 21.761 | 22.73 |
| 1901-09-12 | 22.438 | 23.111 | 21.765 | 22.73 |
| 1901-09-13 | 22.441 | 23.114 | 21.768 | 22.73 |
| 1901-09-14 | 22.441 | 23.114 | 21.768 | 22.73 |
| 1901-09-15 | 22.441 | 23.114 | 21.768 | 22.735 |
| 1901-09-16 | 22.441 | 23.114 | 21.768 | 22.735 |
| 1901-09-17 | 22.439 | 23.112 | 21.766 | 22.735 |
| 1901-09-18 | 22.443 | 23.116 | 21.77 | 22.735 |
| 1901-09-19 | 22.446 | 23.119 | 21.773 | 22.735 |
| 1901-09-20 | 22.446 | 23.119 | 21.773 | 22.735 |
| 1901-09-21 | 22.45 | 23.124 | 21.776 | 22.735 |
| 1901-09-22 | 22.45 | 23.124 | 21.776 | 22.735 |
| 1901-09-23 | 22.45 | 23.124 | 21.776 | 22.735 |
| 1901-09-24 | 22.448 | 23.121 | 21.775 | 22.735 |
| 1901-09-25 | 22.456 | 23.13 | 21.782 | 22.735 |
| 1901-09-26 | 22.464 | 23.138 | 21.79 | 22.735 |
| 1901-09-27 | 22.47 | 23.144 | 21.796 | 22.735 |
| 1901-09-28 | 22.47 | 23.144 | 21.796 | 22.735 |
| 1901-09-29 | 22.47 | 23.144 | 21.796 | 22.735 |
| 1901-09-30 | 22.47 | 23.144 | 21.796 | 22.735 |
| 1901-10-01 | 22.468 | 23.142 | 21.794 | 22.735 |
| 1901-10-02 | 22.473 | 23.147 | 21.799 | 22.735 |
| 1901-10-03 | 22.473 | 23.147 | 21.799 | 22.735 |
| 1901-10-04 | 22.468 | 23.142 | 21.794 | 22.735 |
| 1901-10-05 | 22.47 | 23.144 | 21.796 | 22.735 |
| 1901-10-06 | 22.47 | 23.144 | 21.796 | 22.735 |
| 1901-10-07 | 22.47 | 23.144 | 21.796 | 22.735 |
| 1901-10-08 | 22.469 | 23.143 | 21.795 | 22.735 |
| 1901-10-09 | 22.467 | 23.141 | 21.793 | 22.735 |
| 1901-10-10 | 22.459 | 23.133 | 21.785 | 22.735 |
| 1901-10-11 | 22.453 | 23.127 | 21.779 | 22.735 |
| 1901-10-12 | 22.453 | 23.127 | 21.779 | 22.73 |
| 1901-10-13 | 22.453 | 23.127 | 21.779 | 22.73 |
| 1901-10-14 | 22.453 | 23.127 | 21.779 | 22.73 |
| 1901-10-15 | 22.451 | 23.125 | 21.777 | 22.73 |
| 1901-10-16 | 22.452 | 23.126 | 21.778 | 22.73 |
| 1901-10-17 | 22.46 | 23.134 | 21.786 | 22.73 |
| 1901-10-18 | 22.462 | 23.136 | 21.788 | 22.73 |
| 1901-10-19 | 22.459 | 23.133 | 21.785 | 22.74 |
| 1901-10-20 | 22.46 | 23.134 | 21.786 | 22.74 |
| 1901-10-21 | 22.46 | 23.134 | 21.786 | 22.74 |
| 1901-10-22 | 22.465 | 23.139 | 21.791 | 22.74 |
| 1901-10-23 | 22.469 | 23.143 | 21.795 | 22.74 |
| 1901-10-24 | 22.47 | 23.144 | 21.796 | 22.74 |
| 1901-10-25 | 22.467 | 23.141 | 21.793 | 22.74 |
| 1901-10-26 | 22.474 | 23.148 | 21.8 | 22.74 |
| 1901-10-27 | 22.474 | 23.148 | 21.8 | 22.74 |
| 1901-10-28 | 22.474 | 23.148 | 21.8 | 22.74 |
| 1901-10-29 | 22.477 | 23.151 | 21.803 | 22.75 |
| 1901-10-30 | 22.471 | 23.145 | 21.797 | 22.75 |
| 1901-10-31 | 22.468 | 23.142 | 21.794 | 22.75 |
| 1901-11-01 | 22.466 | 23.14 | 21.792 | 22.75 |
| 1901-11-02 | 22.462 | 23.136 | 21.788 | 22.75 |
| 1901-11-03 | 22.462 | 23.136 | 21.788 | 22.75 |
| 1901-11-04 | 22.462 | 23.136 | 21.788 | 22.75 |
| 1901-11-05 | 22.469 | 23.143 | 21.795 | 22.75 |
| 1901-11-06 | 22.466 | 23.14 | 21.792 | 22.76 |
| 1901-11-07 | 22.47 | 23.144 | 21.796 | 22.76 |
| 1901-11-08 | 22.469 | 23.143 | 21.795 | 22.76 |
| 1901-11-09 | 22.465 | 23.139 | 21.791 | 22.76 |
| 1901-11-10 | 22.465 | 23.139 | 21.791 | 22.76 |
| 1901-11-11 | 22.465 | 23.139 | 21.791 | 22.76 |
| 1901-11-12 | 22.462 | 23.136 | 21.788 | 22.76 |
| 1901-11-13 | 22.466 | 23.14 | 21.792 | 22.76 |
| 1901-11-14 | 22.456 | 23.13 | 21.782 | 22.77 |
| 1901-11-15 | 22.449 | 23.122 | 21.776 | 22.77 |
| 1901-11-16 | 22.446 | 23.119 | 21.773 | 22.77 |
| 1901-11-17 | 22.446 | 23.119 | 21.773 | 22.77 |
| 1901-11-18 | 22.446 | 23.119 | 21.773 | 22.77 |
| 1901-11-19 | 22.442 | 23.115 | 21.769 | 22.77 |
| 1901-11-20 | 22.446 | 23.119 | 21.773 | 22.77 |
| 1901-11-21 | 22.441 | 23.114 | 21.768 | 22.77 |
| 1901-11-22 | 22.431 | 23.104 | 21.758 | 22.77 |
| 1901-11-23 | 22.43 | 23.103 | 21.757 | 22.77 |
| 1901-11-24 | 22.43 | 23.103 | 21.757 | 22.77 |
| 1901-11-25 | 22.43 | 23.103 | 21.757 | 22.78 |
| 1901-11-26 | 22.431 | 23.104 | 21.758 | 22.78 |
| 1901-11-27 | 22.428 | 23.101 | 21.755 | 22.78 |
| 1901-11-28 | 22.428 | 23.101 | 21.755 | 22.78 |
| 1901-11-29 | 22.433 | 23.106 | 21.76 | 22.78 |
| 1901-11-30 | 22.438 | 23.111 | 21.765 | 22.78 |
| 1901-12-01 | 22.438 | 23.111 | 21.765 | 22.78 |
| 1901-12-02 | 22.438 | 23.111 | 21.765 | 22.78 |
| 1901-12-03 | 22.429 | 23.102 | 21.756 | 22.79 |
| 1901-12-04 | 22.439 | 23.112 | 21.766 | 22.79 |
| 1901-12-05 | 22.443 | 23.116 | 21.77 | 22.79 |
| 1901-12-06 | 22.445 | 23.118 | 21.772 | 22.79 |
| 1901-12-07 | 22.452 | 23.126 | 21.778 | 22.8 |
| 1901-12-08 | 22.452 | 23.126 | 21.778 | 22.8 |
| 1901-12-09 | 22.452 | 23.126 | 21.778 | 22.8 |
| 1901-12-10 | 22.454 | 23.128 | 21.78 | 22.815 |
| 1901-12-11 | 22.45 | 23.124 | 21.776 | 22.815 |
| 1901-12-12 | 22.45 | 23.124 | 21.776 | 22.815 |
| 1901-12-13 | 22.443 | 23.116 | 21.77 | 22.8 |
| 1901-12-14 | 22.441 | 23.114 | 21.768 | 22.8 |
| 1901-12-15 | 22.441 | 23.114 | 21.768 | 22.8 |
| 1901-12-16 | 22.441 | 23.114 | 21.768 | 22.79 |
| 1901-12-17 | 22.439 | 23.112 | 21.766 | 22.79 |
| 1901-12-18 | 22.445 | 23.118 | 21.772 | 22.79 |
| 1901-12-19 | 22.437 | 23.11 | 21.764 | 22.79 |
| 1901-12-20 | 22.43 | 23.103 | 21.757 | 22.77 |
| 1901-12-21 | 22.433 | 23.106 | 21.76 | 22.77 |
| 1901-12-22 | 22.433 | 23.106 | 21.76 | 22.77 |
| 1901-12-23 | 22.433 | 23.106 | 21.76 | 22.76 |
| 1901-12-24 | 22.43 | 23.103 | 21.757 | 22.76 |
| 1901-12-25 | 22.425 | 23.098 | 21.752 | 22.76 |
| 1901-12-26 | 22.419 | 23.092 | 21.746 | 22.75 |
| 1901-12-27 | 22.419 | 23.092 | 21.746 | 22.75 |
| 1901-12-28 | 22.425 | 23.098 | 21.752 | 22.75 |
| 1901-12-29 | 22.425 | 23.098 | 21.752 | 22.74 |
| 1901-12-30 | 22.425 | 23.098 | 21.752 | 22.74 |
| 1901-12-31 | 22.425 | 23.098 | 21.752 | 22.74 |
| 1902-01-01 | 22.415 | 23.087 | 21.743 | 22.74 |
| 1902-01-02 | 22.405 | 23.077 | 21.733 | 22.73 |
| 1902-01-03 | 22.411 | 23.083 | 21.739 | 22.73 |
| 1902-01-04 | 22.407 | 23.079 | 21.735 | 22.73 |
| 1902-01-05 | 22.407 | 23.079 | 21.735 | 22.73 |
| 1902-01-06 | 22.407 | 23.079 | 21.735 | 22.72 |
| 1902-01-07 | 22.401 | 23.073 | 21.729 | 22.72 |
| 1902-01-08 | 22.416 | 23.088 | 21.744 | 22.72 |
| 1902-01-09 | 22.425 | 23.098 | 21.752 | 22.71 |
| 1902-01-10 | 22.413 | 23.085 | 21.741 | 22.71 |
| 1902-01-11 | 22.406 | 23.078 | 21.734 | 22.71 |
| 1902-01-12 | 22.406 | 23.078 | 21.734 | 22.71 |
| 1902-01-13 | 22.406 | 23.078 | 21.734 | 22.71 |
| 1902-01-14 | 22.396 | 23.068 | 21.724 | 22.72 |
| 1902-01-15 | 22.386 | 23.058 | 21.714 | 22.72 |
| 1902-01-16 | 22.391 | 23.063 | 21.719 | 22.72 |
| 1902-01-17 | 22.406 | 23.078 | 21.734 | 22.72 |
| 1902-01-18 | 22.406 | 23.078 | 21.734 | 22.73 |
| 1902-01-19 | 22.406 | 23.078 | 21.734 | 22.73 |
| 1902-01-20 | 22.406 | 23.078 | 21.734 | 22.73 |
| 1902-01-21 | 22.401 | 23.073 | 21.729 | 22.73 |
| 1902-01-22 | 22.411 | 23.083 | 21.739 | 22.73 |
| 1902-01-23 | 22.416 | 23.088 | 21.744 | 22.73 |
| 1902-01-24 | 22.406 | 23.078 | 21.734 | 22.74 |
| 1902-01-25 | 22.416 | 23.088 | 21.744 | 22.74 |
| 1902-01-26 | 22.416 | 23.088 | 21.744 | 22.74 |
| 1902-01-27 | 22.416 | 23.088 | 21.744 | 22.74 |
| 1902-01-28 | 22.426 | 23.099 | 21.753 | 22.74 |
| 1902-01-29 | 22.441 | 23.114 | 21.768 | 22.74 |
| 1902-01-30 | 22.441 | 23.114 | 21.768 | 22.75 |
| 1902-01-31 | 22.431 | 23.104 | 21.758 | 22.75 |
| 1902-02-01 | 22.426 | 23.099 | 21.753 | 22.75 |
| 1902-02-02 | 22.426 | 23.099 | 21.753 | 22.75 |
| 1902-02-03 | 22.426 | 23.099 | 21.753 | 22.75 |
| 1902-02-04 | 22.444 | 23.117 | 21.771 | 22.75 |
| 1902-02-05 | 22.45 | 23.124 | 21.776 | 22.75 |
| 1902-02-06 | 22.445 | 23.118 | 21.772 | 22.76 |
| 1902-02-07 | 22.435 | 23.108 | 21.762 | 22.76 |
| 1902-02-08 | 22.44 | 23.113 | 21.767 | 22.76 |
| 1902-02-09 | 22.44 | 23.113 | 21.767 | 22.76 |
| 1902-02-10 | 22.44 | 23.113 | 21.767 | 22.76 |
| 1902-02-11 | 22.43 | 23.103 | 21.757 | 22.76 |
| 1902-02-12 | 22.438 | 23.111 | 21.765 | 22.76 |
| 1902-02-13 | 22.438 | 23.111 | 21.765 | 22.76 |
| 1902-02-14 | 22.438 | 23.111 | 21.765 | 22.76 |
| 1902-02-15 | 22.438 | 23.111 | 21.765 | 22.77 |
| 1902-02-16 | 22.438 | 23.111 | 21.765 | 22.77 |
| 1902-02-17 | 22.438 | 23.111 | 21.765 | 22.77 |
| 1902-02-18 | 22.438 | 23.111 | 21.765 | 22.77 |
| 1902-02-19 | 22.438 | 23.111 | 21.765 | 22.77 |
| 1902-02-20 | 22.423 | 23.096 | 21.75 | 22.77 |
| 1902-02-21 | 22.433 | 23.106 | 21.76 | 22.77 |
| 1902-02-22 | 22.443 | 23.116 | 21.77 | 22.77 |
| 1902-02-23 | 22.443 | 23.116 | 21.77 | 22.77 |
| 1902-02-24 | 22.443 | 23.116 | 21.77 | 22.77 |
| 1902-02-25 | 22.448 | 23.121 | 21.775 | 22.77 |
| 1902-02-26 | 22.448 | 23.121 | 21.775 | 22.77 |
| 1902-02-27 | 22.463 | 23.137 | 21.789 | 22.785 |
| 1902-02-28 | 22.473 | 23.147 | 21.799 | 22.785 |
| 1902-03-01 | 22.468 | 23.142 | 21.794 | 22.785 |
| 1902-03-02 | 22.468 | 23.142 | 21.794 | 22.79 |
| 1902-03-03 | 22.468 | 23.142 | 21.794 | 22.79 |
| 1902-03-04 | 22.458 | 23.132 | 21.784 | 22.8 |
| 1902-03-05 | 22.458 | 23.132 | 21.784 | 22.8 |
| 1902-03-06 | 22.453 | 23.127 | 21.779 | 22.8 |
| 1902-03-07 | 22.443 | 23.116 | 21.77 | 22.8 |
| 1902-03-08 | 22.456 | 23.13 | 21.782 | 22.8 |
| 1902-03-09 | 22.456 | 23.13 | 21.782 | 22.8 |
| 1902-03-10 | 22.456 | 23.13 | 21.782 | 22.8 |
| 1902-03-11 | 22.461 | 23.135 | 21.787 | 22.8 |
| 1902-03-12 | 22.45 | 23.124 | 21.776 | 22.8 |
| 1902-03-13 | 22.44 | 23.113 | 21.767 | 22.8 |
| 1902-03-14 | 22.44 | 23.113 | 21.767 | 22.8 |
| 1902-03-15 | 22.445 | 23.118 | 21.772 | 22.8 |
| 1902-03-16 | 22.445 | 23.118 | 21.772 | 22.8 |
| 1902-03-17 | 22.445 | 23.118 | 21.772 | 22.8 |
| 1902-03-18 | 22.455 | 23.129 | 21.781 | 22.8 |
| 1902-03-19 | 22.45 | 23.124 | 21.776 | 22.8 |
| 1902-03-20 | 22.459 | 23.133 | 21.785 | 22.8 |
| 1902-03-21 | 22.452 | 23.126 | 21.778 | 22.8 |
| 1902-03-22 | 22.455 | 23.129 | 21.781 | 22.795 |
| 1902-03-23 | 22.455 | 23.129 | 21.781 | 22.795 |
| 1902-03-24 | 22.455 | 23.129 | 21.781 | 22.795 |
| 1902-03-25 | 22.455 | 23.129 | 21.781 | 22.795 |
| 1902-03-26 | 22.443 | 23.116 | 21.77 | 22.795 |
| 1902-03-27 | 22.453 | 23.127 | 21.779 | 22.795 |
| 1902-03-28 | 22.463 | 23.137 | 21.789 | 22.795 |
| 1902-03-29 | 22.458 | 23.132 | 21.784 | 22.795 |
| 1902-03-30 | 22.458 | 23.132 | 21.784 | 22.795 |
| 1902-03-31 | 22.458 | 23.132 | 21.784 | 22.795 |
| 1902-04-01 | 22.448 | 23.121 | 21.775 | 22.795 |
| 1902-04-02 | 22.442 | 23.115 | 21.769 | 22.805 |
| 1902-04-03 | 22.457 | 23.131 | 21.783 | 22.805 |
| 1902-04-04 | 22.467 | 23.141 | 21.793 | 22.805 |
| 1902-04-05 | 22.477 | 23.151 | 21.803 | 22.805 |
| 1902-04-06 | 22.477 | 23.151 | 21.803 | 22.805 |
| 1902-04-07 | 22.477 | 23.151 | 21.803 | 22.805 |
| 1902-04-08 | 22.475 | 23.149 | 21.801 | 22.815 |
| 1902-04-09 | 22.472 | 23.146 | 21.798 | 22.815 |
| 1902-04-10 | 22.477 | 23.151 | 21.803 | 22.815 |
| 1902-04-11 | 22.477 | 23.151 | 21.803 | 22.815 |
| 1902-04-12 | 22.492 | 23.167 | 21.817 | 22.815 |
| 1902-04-13 | 22.492 | 23.167 | 21.817 | 22.815 |
| 1902-04-14 | 22.492 | 23.167 | 21.817 | 22.825 |
| 1902-04-15 | 22.487 | 23.162 | 21.812 | 22.825 |
| 1902-04-16 | 22.477 | 23.151 | 21.803 | 22.825 |
| 1902-04-17 | 22.488 | 23.163 | 21.813 | 22.825 |
| 1902-04-18 | 22.492 | 23.167 | 21.817 | 22.825 |
| 1902-04-19 | 22.492 | 23.167 | 21.817 | 22.825 |
| 1902-04-20 | 22.492 | 23.167 | 21.817 | 22.825 |
| 1902-04-21 | 22.492 | 23.167 | 21.817 | 22.825 |
| 1902-04-22 | 22.507 | 23.182 | 21.832 | 22.835 |
| 1902-04-23 | 22.522 | 23.198 | 21.846 | 22.835 |
| 1902-04-24 | 22.522 | 23.198 | 21.846 | 22.835 |
| 1902-04-25 | 22.537 | 23.213 | 21.861 | 22.835 |
| 1902-04-26 | 22.539 | 23.215 | 21.863 | 22.835 |
| 1902-04-27 | 22.539 | 23.215 | 21.863 | 22.835 |
| 1902-04-28 | 22.539 | 23.215 | 21.863 | 22.835 |
| 1902-04-29 | 22.539 | 23.215 | 21.863 | 22.84 |
| 1902-04-30 | 22.539 | 23.215 | 21.863 | 22.84 |
| 1902-05-01 | 22.548 | 23.224 | 21.872 | 22.84 |
| 1902-05-02 | 22.557 | 23.234 | 21.88 | 22.84 |
| 1902-05-03 | 22.552 | 23.229 | 21.875 | 22.84 |
| 1902-05-04 | 22.552 | 23.229 | 21.875 | 22.84 |
| 1902-05-05 | 22.552 | 23.229 | 21.875 | 22.84 |
| 1902-05-06 | 22.558 | 23.235 | 21.881 | 22.84 |
| 1902-05-07 | 22.566 | 23.243 | 21.889 | 22.84 |
| 1902-05-08 | 22.568 | 23.245 | 21.891 | 22.84 |
| 1902-05-09 | 22.578 | 23.255 | 21.901 | 22.84 |
| 1902-05-10 | 22.56 | 23.237 | 21.883 | 22.84 |
| 1902-05-11 | 22.56 | 23.237 | 21.883 | 22.84 |
| 1902-05-12 | 22.56 | 23.237 | 21.883 | 22.84 |
| 1902-05-13 | 22.55 | 23.226 | 21.874 | 22.84 |
| 1902-05-14 | 22.548 | 23.224 | 21.872 | 22.84 |
| 1902-05-15 | 22.568 | 23.245 | 21.891 | 22.84 |
| 1902-05-16 | 22.584 | 23.262 | 21.906 | 22.835 |
| 1902-05-17 | 22.59 | 23.268 | 21.912 | 22.835 |
| 1902-05-18 | 22.59 | 23.268 | 21.912 | 22.835 |
| 1902-05-19 | 22.59 | 23.268 | 21.912 | 22.835 |
| 1902-05-20 | 22.59 | 23.268 | 21.912 | 22.835 |
| 1902-05-21 | 22.595 | 23.273 | 21.917 | 22.835 |
| 1902-05-22 | 22.584 | 23.262 | 21.906 | 22.835 |
| 1902-05-23 | 22.589 | 23.267 | 21.911 | 22.835 |
| 1902-05-24 | 22.589 | 23.267 | 21.911 | 22.835 |
| 1902-05-25 | 22.589 | 23.267 | 21.911 | 22.835 |
| 1902-05-26 | 22.589 | 23.267 | 21.911 | 22.845 |
| 1902-05-27 | 22.596 | 23.274 | 21.918 | 22.845 |
| 1902-05-28 | 22.605 | 23.283 | 21.927 | 22.845 |
| 1902-05-29 | 22.59 | 23.268 | 21.912 | 22.845 |
| 1902-05-30 | 22.595 | 23.273 | 21.917 | 22.845 |
| 1902-05-31 | 22.566 | 23.243 | 21.889 | 22.89 |
| 1902-06-01 | 22.566 | 23.243 | 21.889 | 22.89 |
| 1902-06-02 | 22.566 | 23.243 | 21.889 | 22.89 |
| 1902-06-03 | 22.571 | 23.248 | 21.894 | 22.89 |
| 1902-06-04 | 22.571 | 23.248 | 21.894 | 22.935 |
| 1902-06-05 | 22.567 | 23.244 | 21.89 | 22.935 |
| 1902-06-06 | 22.562 | 23.239 | 21.885 | 22.935 |
| 1902-06-07 | 22.558 | 23.235 | 21.881 | 22.935 |
| 1902-06-08 | 22.558 | 23.235 | 21.881 | 22.965 |
| 1902-06-09 | 22.558 | 23.235 | 21.881 | 22.965 |
| 1902-06-10 | 22.567 | 23.244 | 21.89 | 22.965 |
| 1902-06-11 | 22.575 | 23.252 | 21.898 | 22.99 |
| 1902-06-12 | 22.578 | 23.255 | 21.901 | 22.99 |
| 1902-06-13 | 22.583 | 23.26 | 21.906 | 23.015 |
| 1902-06-14 | 22.595 | 23.273 | 21.917 | 23.015 |
| 1902-06-15 | 22.595 | 23.273 | 21.917 | 23.015 |
| 1902-06-16 | 22.595 | 23.273 | 21.917 | 23.04 |
| 1902-06-17 | 22.602 | 23.28 | 21.924 | 23.04 |
| 1902-06-18 | 22.602 | 23.28 | 21.924 | 23.04 |
| 1902-06-19 | 22.617 | 23.296 | 21.938 | 23.04 |
| 1902-06-20 | 22.622 | 23.301 | 21.943 | 23.065 |
| 1902-06-21 | 22.62 | 23.299 | 21.941 | 23.065 |
| 1902-06-22 | 22.62 | 23.299 | 21.941 | 23.065 |
| 1902-06-23 | 22.62 | 23.299 | 21.941 | 23.1 |
| 1902-06-24 | 22.615 | 23.293 | 21.937 | 23.1 |
| 1902-06-25 | 22.625 | 23.304 | 21.946 | 23.1 |
| 1902-06-26 | 22.64 | 23.319 | 21.961 | 23.1 |
| 1902-06-27 | 22.655 | 23.335 | 21.975 | 23.1 |
| 1902-06-28 | 22.65 | 23.33 | 21.97 | 23.1 |
| 1902-06-29 | 22.65 | 23.33 | 21.97 | 23.115 |
| 1902-06-30 | 22.65 | 23.33 | 21.97 | 23.115 |
| 1902-07-01 | 22.635 | 23.314 | 21.956 | 23.115 |
| 1902-07-02 | 22.635 | 23.314 | 21.956 | 23.115 |
| 1902-07-03 | 22.63 | 23.309 | 21.951 | 23.155 |
| 1902-07-04 | 22.638 | 23.317 | 21.959 | 23.155 |
| 1902-07-05 | 22.638 | 23.317 | 21.959 | 23.155 |
| 1902-07-06 | 22.638 | 23.317 | 21.959 | 23.185 |
| 1902-07-07 | 22.638 | 23.317 | 21.959 | 23.185 |
| 1902-07-08 | 22.632 | 23.311 | 21.953 | 23.185 |
| 1902-07-09 | 22.64 | 23.319 | 21.961 | 23.235 |
| 1902-07-10 | 22.647 | 23.326 | 21.968 | 23.235 |
| 1902-07-11 | 22.652 | 23.332 | 21.972 | 23.235 |
| 1902-07-12 | 22.648 | 23.327 | 21.969 | 23.235 |
| 1902-07-13 | 22.648 | 23.327 | 21.969 | 23.275 |
| 1902-07-14 | 22.648 | 23.327 | 21.969 | 23.275 |
| 1902-07-15 | 22.653 | 23.333 | 21.973 | 23.275 |
| 1902-07-16 | 22.643 | 23.322 | 21.964 | 23.275 |
| 1902-07-17 | 22.649 | 23.328 | 21.97 | 23.325 |
| 1902-07-18 | 22.662 | 23.342 | 21.982 | 23.325 |
| 1902-07-19 | 22.66 | 23.34 | 21.98 | 23.325 |
| 1902-07-20 | 22.66 | 23.34 | 21.98 | 23.325 |
| 1902-07-21 | 22.66 | 23.34 | 21.98 | 23.355 |
| 1902-07-22 | 22.644 | 23.323 | 21.965 | 23.355 |
| 1902-07-23 | 22.654 | 23.334 | 21.974 | 23.375 |
| 1902-07-24 | 22.654 | 23.334 | 21.974 | 23.375 |
| 1902-07-25 | 22.649 | 23.328 | 21.97 | 23.39 |
| 1902-07-26 | 22.649 | 23.328 | 21.97 | 23.415 |
| 1902-07-27 | 22.649 | 23.328 | 21.97 | 23.415 |
| 1902-07-28 | 22.649 | 23.328 | 21.97 | 23.415 |
| 1902-07-29 | 22.659 | 23.339 | 21.979 | 23.435 |
| 1902-07-30 | 22.669 | 23.349 | 21.989 | 23.435 |
| 1902-07-31 | 22.669 | 23.349 | 21.989 | 23.435 |
| 1902-08-01 | 22.666 | 23.346 | 21.986 | 23.435 |
| 1902-08-02 | 22.676 | 23.356 | 21.996 | 23.465 |
| 1902-08-03 | 22.676 | 23.356 | 21.996 | 23.465 |
| 1902-08-04 | 22.676 | 23.356 | 21.996 | 23.465 |
| 1902-08-05 | 22.676 | 23.356 | 21.996 | 23.465 |
| 1902-08-06 | 22.676 | 23.356 | 21.996 | 23.465 |
| 1902-08-07 | 22.671 | 23.351 | 21.991 | 23.49 |
| 1902-08-08 | 22.666 | 23.346 | 21.986 | 23.49 |
| 1902-08-09 | 22.676 | 23.356 | 21.996 | 23.49 |
| 1902-08-10 | 22.676 | 23.356 | 21.996 | 23.515 |
| 1902-08-11 | 22.676 | 23.356 | 21.996 | 23.515 |
| 1902-08-12 | 22.686 | 23.367 | 22.005 | 23.515 |
| 1902-08-13 | 22.686 | 23.367 | 22.005 | 23.535 |
| 1902-08-14 | 22.685 | 23.366 | 22.004 | 23.585 |
| 1902-08-15 | 22.691 | 23.372 | 22.01 | 23.645 |
| 1902-08-16 | 22.689 | 23.37 | 22.008 | 23.62 |
| 1902-08-17 | 22.689 | 23.37 | 22.008 | 23.6 |
| 1902-08-18 | 22.689 | 23.37 | 22.008 | 23.6 |
| 1902-08-19 | 22.684 | 23.365 | 22.003 | 23.565 |
| 1902-08-20 | 22.679 | 23.359 | 21.999 | 23.525 |
| 1902-08-21 | 22.674 | 23.354 | 21.994 | 23.5 |
| 1902-08-22 | 22.678 | 23.358 | 21.998 | 23.515 |
| 1902-08-23 | 22.688 | 23.369 | 22.007 | 23.515 |
| 1902-08-24 | 22.688 | 23.369 | 22.007 | 23.495 |
| 1902-08-25 | 22.688 | 23.369 | 22.007 | 23.495 |
| 1902-08-26 | 22.683 | 23.363 | 22.003 | 23.495 |
| 1902-08-27 | 22.687 | 23.368 | 22.006 | 23.48 |
| 1902-08-28 | 22.673 | 23.353 | 21.993 | 23.48 |
| 1902-08-29 | 22.683 | 23.363 | 22.003 | 23.48 |
| 1902-08-30 | 22.678 | 23.358 | 21.998 | 23.48 |
| 1902-08-31 | 22.678 | 23.358 | 21.998 | 23.465 |
| 1902-09-01 | 22.678 | 23.358 | 21.998 | 23.465 |
| 1902-09-02 | 22.678 | 23.358 | 21.998 | 23.465 |
| 1902-09-03 | 22.688 | 23.369 | 22.007 | 23.465 |
| 1902-09-04 | 22.688 | 23.369 | 22.007 | 23.455 |
| 1902-09-05 | 22.688 | 23.369 | 22.007 | 23.455 |
| 1902-09-06 | 22.686 | 23.367 | 22.005 | 23.455 |
| 1902-09-07 | 22.686 | 23.367 | 22.005 | 23.455 |
| 1902-09-08 | 22.686 | 23.367 | 22.005 | 23.455 |
| 1902-09-09 | 22.694 | 23.375 | 22.013 | 23.455 |
| 1902-09-10 | 22.703 | 23.384 | 22.022 | 23.455 |
| 1902-09-11 | 22.698 | 23.379 | 22.017 | 23.455 |
| 1902-09-12 | 22.695 | 23.376 | 22.014 | 23.455 |
| 1902-09-13 | 22.69 | 23.371 | 22.009 | 23.455 |
| 1902-09-14 | 22.69 | 23.371 | 22.009 | 23.455 |
| 1902-09-15 | 22.69 | 23.371 | 22.009 | 23.455 |
| 1902-09-16 | 22.69 | 23.371 | 22.009 | 23.455 |
| 1902-09-17 | 22.7 | 23.381 | 22.019 | 23.445 |
| 1902-09-18 | 22.71 | 23.391 | 22.029 | 23.445 |
| 1902-09-19 | 22.705 | 23.386 | 22.024 | 23.445 |
| 1902-09-20 | 22.712 | 23.393 | 22.031 | 23.445 |
| 1902-09-21 | 22.712 | 23.393 | 22.031 | 23.445 |
| 1902-09-22 | 22.712 | 23.393 | 22.031 | 23.445 |
| 1902-09-23 | 22.709 | 23.39 | 22.028 | 23.445 |
| 1902-09-24 | 22.715 | 23.396 | 22.034 | 23.445 |
| 1902-09-25 | 22.717 | 23.399 | 22.035 | 23.445 |
| 1902-09-26 | 22.715 | 23.396 | 22.034 | 23.435 |
| 1902-09-27 | 22.714 | 23.395 | 22.033 | 23.435 |
| 1902-09-28 | 22.714 | 23.395 | 22.033 | 23.435 |
| 1902-09-29 | 22.714 | 23.395 | 22.033 | 23.435 |
| 1902-09-30 | 22.713 | 23.394 | 22.032 | 23.465 |
| 1902-10-01 | 22.716 | 23.397 | 22.035 | 23.465 |
| 1902-10-02 | 22.718 | 23.4 | 22.036 | 23.465 |
| 1902-10-03 | 22.72 | 23.402 | 22.038 | 23.465 |
| 1902-10-04 | 22.72 | 23.402 | 22.038 | 23.465 |
| 1902-10-05 | 22.72 | 23.402 | 22.038 | 23.465 |
| 1902-10-06 | 22.72 | 23.402 | 22.038 | 23.455 |
| 1902-10-07 | 22.721 | 23.403 | 22.039 | 23.455 |
| 1902-10-08 | 22.723 | 23.405 | 22.041 | 23.455 |
| 1902-10-09 | 22.721 | 23.403 | 22.039 | 23.455 |
| 1902-10-10 | 22.719 | 23.401 | 22.037 | 23.455 |
| 1902-10-11 | 22.721 | 23.403 | 22.039 | 23.455 |
| 1902-10-12 | 22.721 | 23.403 | 22.039 | 23.455 |
| 1902-10-13 | 22.721 | 23.403 | 22.039 | 23.455 |
| 1902-10-14 | 22.719 | 23.401 | 22.037 | 23.445 |
| 1902-10-15 | 22.717 | 23.399 | 22.035 | 23.445 |
| 1902-10-16 | 22.715 | 23.396 | 22.034 | 23.445 |
| 1902-10-17 | 22.717 | 23.399 | 22.035 | 23.445 |
| 1902-10-18 | 22.719 | 23.401 | 22.037 | 23.445 |
| 1902-10-19 | 22.719 | 23.401 | 22.037 | 23.455 |
| 1902-10-20 | 22.719 | 23.401 | 22.037 | 23.455 |
| 1902-10-21 | 22.717 | 23.399 | 22.035 | 23.455 |
| 1902-10-22 | 22.719 | 23.401 | 22.037 | 23.455 |
| 1902-10-23 | 22.721 | 23.403 | 22.039 | 23.455 |
| 1902-10-24 | 22.721 | 23.403 | 22.039 | 23.455 |
| 1902-10-25 | 22.723 | 23.405 | 22.041 | 23.465 |
| 1902-10-26 | 22.723 | 23.405 | 22.041 | 23.465 |
| 1902-10-27 | 22.723 | 23.405 | 22.041 | 23.465 |
| 1902-10-28 | 22.722 | 23.404 | 22.04 | 23.465 |
| 1902-10-29 | 22.724 | 23.406 | 22.042 | 23.465 |
| 1902-10-30 | 22.726 | 23.408 | 22.044 | 23.465 |
| 1902-10-31 | 22.727 | 23.409 | 22.045 | 23.455 |
| 1902-11-01 | 22.725 | 23.407 | 22.043 | 23.455 |
| 1902-11-02 | 22.725 | 23.407 | 22.043 | 23.455 |
| 1902-11-03 | 22.725 | 23.407 | 22.043 | 23.455 |
| 1902-11-04 | 22.723 | 23.405 | 22.041 | 23.435 |
| 1902-11-05 | 22.725 | 23.407 | 22.043 | 23.435 |
| 1902-11-06 | 22.727 | 23.409 | 22.045 | 23.415 |
| 1902-11-07 | 22.725 | 23.407 | 22.043 | 23.415 |
| 1902-11-08 | 22.723 | 23.405 | 22.041 | 23.415 |
| 1902-11-09 | 22.723 | 23.405 | 22.041 | 23.415 |
| 1902-11-10 | 22.723 | 23.405 | 22.041 | 23.415 |
| 1902-11-11 | 22.721 | 23.403 | 22.039 | 23.415 |
| 1902-11-12 | 22.727 | 23.409 | 22.045 | 23.415 |
| 1902-11-13 | 22.725 | 23.407 | 22.043 | 23.415 |
| 1902-11-14 | 22.723 | 23.405 | 22.041 | 23.415 |
| 1902-11-15 | 22.721 | 23.403 | 22.039 | 23.4 |
| 1902-11-16 | 22.721 | 23.403 | 22.039 | 23.4 |
| 1902-11-17 | 22.721 | 23.403 | 22.039 | 23.4 |
| 1902-11-18 | 22.721 | 23.403 | 22.039 | 23.365 |
| 1902-11-19 | 22.726 | 23.408 | 22.044 | 23.365 |
| 1902-11-20 | 22.731 | 23.413 | 22.049 | 23.365 |
| 1902-11-21 | 22.733 | 23.415 | 22.051 | 23.365 |
| 1902-11-22 | 22.743 | 23.425 | 22.061 | 23.35 |
| 1902-11-23 | 22.743 | 23.425 | 22.061 | 23.35 |
| 1902-11-24 | 22.743 | 23.425 | 22.061 | 23.35 |
| 1902-11-25 | 22.743 | 23.425 | 22.061 | 23.35 |
| 1902-11-26 | 22.747 | 23.429 | 22.065 | 23.315 |
| 1902-11-27 | 22.747 | 23.429 | 22.065 | 23.315 |
| 1902-11-28 | 22.747 | 23.429 | 22.065 | 23.315 |
| 1902-11-29 | 22.75 | 23.432 | 22.068 | 23.295 |
| 1902-11-30 | 22.75 | 23.432 | 22.068 | 23.295 |
| 1902-12-01 | 22.75 | 23.432 | 22.068 | 23.295 |
| 1902-12-02 | 22.755 | 23.438 | 22.072 | 23.295 |
| 1902-12-03 | 22.755 | 23.438 | 22.072 | 23.295 |
| 1902-12-04 | 22.757 | 23.44 | 22.074 | 23.265 |
| 1902-12-05 | 22.762 | 23.445 | 22.079 | 23.265 |
| 1902-12-06 | 22.764 | 23.447 | 22.081 | 23.265 |
| 1902-12-07 | 22.764 | 23.447 | 22.081 | 23.255 |
| 1902-12-08 | 22.764 | 23.447 | 22.081 | 23.255 |
| 1902-12-09 | 22.766 | 23.449 | 22.083 | 23.255 |
| 1902-12-10 | 22.775 | 23.458 | 22.092 | 23.255 |
| 1902-12-11 | 22.775 | 23.458 | 22.092 | 23.255 |
| 1902-12-12 | 22.773 | 23.456 | 22.09 | 23.255 |
| 1902-12-13 | 22.778 | 23.461 | 22.095 | 23.255 |
| 1902-12-14 | 22.778 | 23.461 | 22.095 | 23.255 |
| 1902-12-15 | 22.778 | 23.461 | 22.095 | 23.235 |
| 1902-12-16 | 22.783 | 23.466 | 22.1 | 23.235 |
| 1902-12-17 | 22.787 | 23.471 | 22.103 | 23.235 |
| 1902-12-18 | 22.785 | 23.469 | 22.101 | 23.235 |
| 1902-12-19 | 22.785 | 23.469 | 22.101 | 23.235 |
| 1902-12-20 | 22.785 | 23.469 | 22.101 | 23.235 |
| 1902-12-21 | 22.785 | 23.469 | 22.101 | 23.235 |
| 1902-12-22 | 22.785 | 23.469 | 22.101 | 23.235 |
| 1902-12-23 | 22.79 | 23.474 | 22.106 | 23.235 |
| 1902-12-24 | 22.79 | 23.474 | 22.106 | 23.235 |
| 1902-12-25 | 22.795 | 23.479 | 22.111 | 23.225 |
| 1902-12-26 | 22.805 | 23.489 | 22.121 | 23.225 |
| 1902-12-27 | 22.825 | 23.51 | 22.14 | 23.225 |
| 1902-12-28 | 22.825 | 23.51 | 22.14 | 23.225 |
| 1902-12-29 | 22.825 | 23.51 | 22.14 | 23.225 |
| 1902-12-30 | 22.829 | 23.514 | 22.144 | 23.215 |
| 1902-12-31 | 22.825 | 23.51 | 22.14 | 23.215 |
| 1903-01-01 | 22.825 | 23.51 | 22.14 | 23.215 |
| 1903-01-02 | 22.828 | 23.513 | 22.143 | 23.215 |
| 1903-01-03 | 22.829 | 23.514 | 22.144 | 23.215 |
| 1903-01-04 | 22.829 | 23.514 | 22.144 | 23.215 |